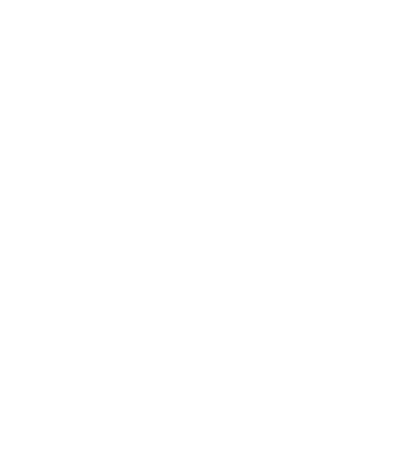
| Category | Total |
|---|---|
| Other 1 | 0 |
| Other 2 | 0 |
| Garbage | 150 |
| Vehicle Tax/Fees | 200 |
| Insurance | 250 |
| Internet | 600 |
| Gas | 600 |
| Water/Sewer | 600 |
| Phone | 600 |
| Medical/Dental/Rx | 600 |
| Electricity | 1200 |
| Clothing | 1200 |
| Disability Premiums | 1500 |
| State Income Tax | 2500 |
| Vehicle Payments | 4000 |
| Food | 5000 |
| Federal/SS/Medicare | 12500 |
| Mortgage/Rent | 15000 |